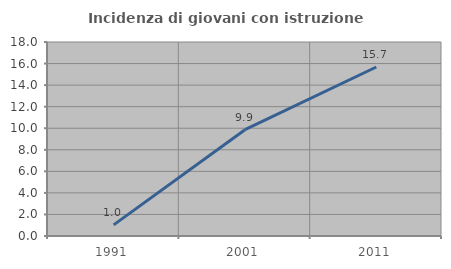
| Category | Incidenza di giovani con istruzione universitaria |
|---|---|
| 1991.0 | 1.034 |
| 2001.0 | 9.865 |
| 2011.0 | 15.681 |